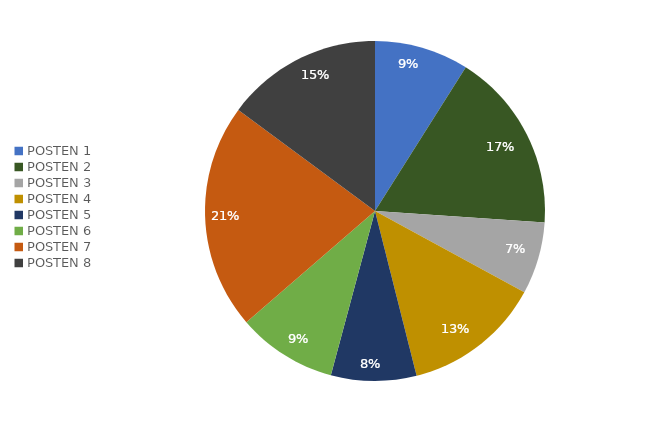
| Category | Series 0 | Series 1 |
|---|---|---|
| POSTEN 1 | 0.09 | 0.09 |
| POSTEN 2 | 0.171 | 0.171 |
| POSTEN 3 | 0.069 | 0.069 |
| POSTEN 4 | 0.131 | 0.131 |
| POSTEN 5 | 0.081 | 0.081 |
| POSTEN 6 | 0.095 | 0.095 |
| POSTEN 7 | 0.215 | 0.215 |
| POSTEN 8 | 0.149 | 0.149 |